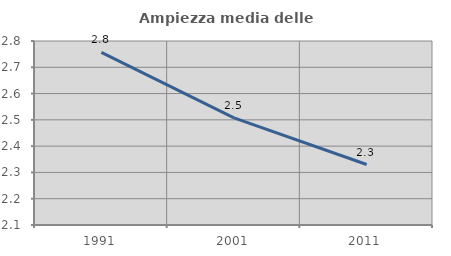
| Category | Ampiezza media delle famiglie |
|---|---|
| 1991.0 | 2.757 |
| 2001.0 | 2.508 |
| 2011.0 | 2.33 |